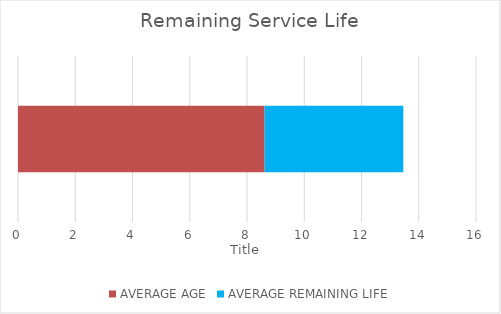
| Category | AVERAGE AGE | AVERAGE REMAINING LIFE |
|---|---|---|
| Vehicles  | 8.616 | 4.845 |